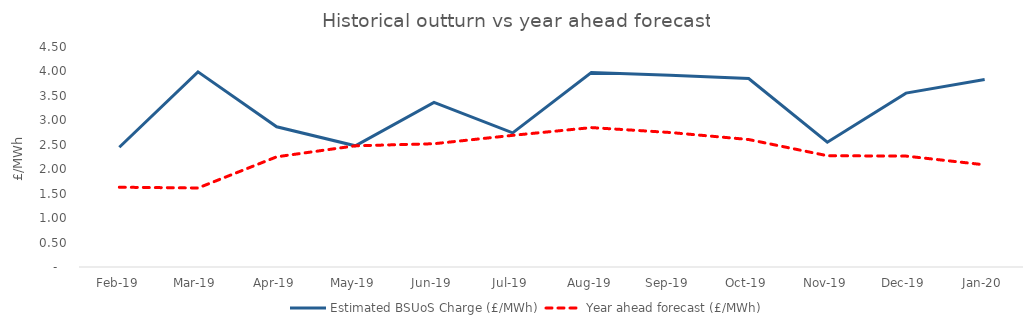
| Category | Estimated BSUoS Charge (£/MWh) | Year ahead forecast (£/MWh) |
|---|---|---|
| Feb-19 | 2.449 | 1.632 |
| Mar-19 | 3.992 | 1.616 |
| Apr-19 | 2.867 | 2.254 |
| May-19 | 2.479 | 2.479 |
| Jun-19 | 3.366 | 2.522 |
| Jul-19 | 2.744 | 2.693 |
| Aug-19 | 3.978 | 2.852 |
| Sep-19 | 3.922 | 2.751 |
| Oct-19 | 3.854 | 2.607 |
| Nov-19 | 2.551 | 2.276 |
| Dec-19 | 3.556 | 2.269 |
| Jan-20 | 3.837 | 2.09 |